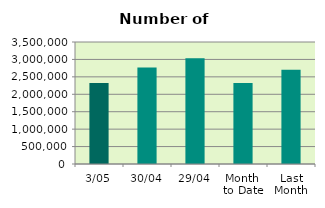
| Category | Series 0 |
|---|---|
| 3/05 | 2323984 |
| 30/04 | 2770494 |
| 29/04 | 3033546 |
| Month 
to Date | 2323984 |
| Last
Month | 2707305.9 |